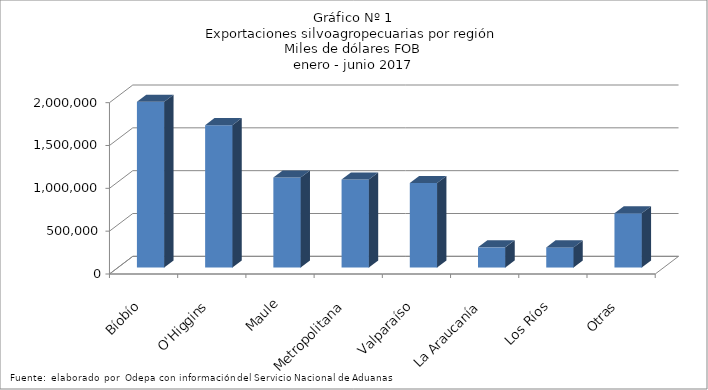
| Category | Series 0 |
|---|---|
| Bíobío | 1933868.785 |
| O'Higgins | 1662176.985 |
| Maule | 1051009.926 |
| Metropolitana | 1026463.147 |
| Valparaíso | 986432.001 |
| La Araucanía | 235336.952 |
| Los Ríos | 235014.626 |
| Otras | 633498.107 |